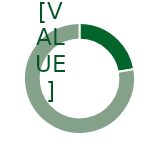
| Category | Series 0 |
|---|---|
| 0 | 0.223 |
| 1 | 0.777 |